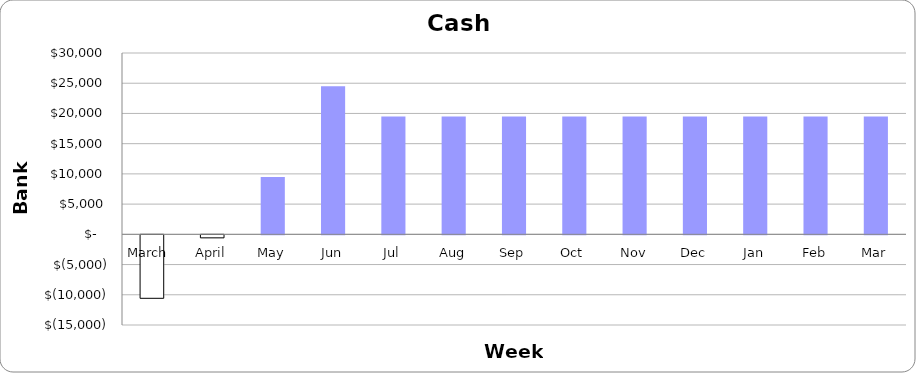
| Category | Available Credit |
|---|---|
| March  | -10500 |
| April | -500 |
| May | 9500 |
| Jun | 24500 |
| Jul | 19500 |
| Aug | 19500 |
| Sep | 19500 |
| Oct | 19500 |
| Nov | 19500 |
| Dec | 19500 |
| Jan | 19500 |
| Feb | 19500 |
| Mar | 19500 |